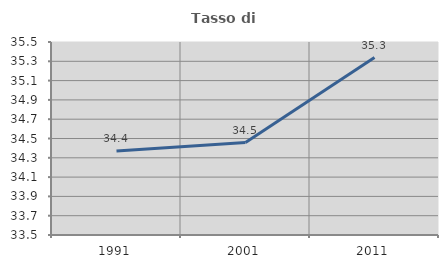
| Category | Tasso di occupazione   |
|---|---|
| 1991.0 | 34.371 |
| 2001.0 | 34.457 |
| 2011.0 | 35.339 |